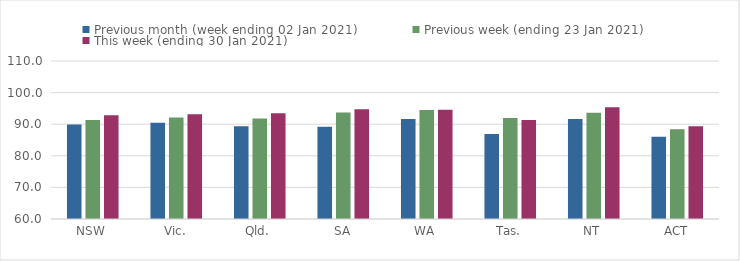
| Category | Previous month (week ending 02 Jan 2021) | Previous week (ending 23 Jan 2021) | This week (ending 30 Jan 2021) |
|---|---|---|---|
| NSW | 89.89 | 91.32 | 92.81 |
| Vic. | 90.47 | 92.15 | 93.12 |
| Qld. | 89.38 | 91.78 | 93.5 |
| SA | 89.17 | 93.69 | 94.75 |
| WA | 91.66 | 94.51 | 94.61 |
| Tas. | 86.91 | 91.98 | 91.34 |
| NT | 91.65 | 93.66 | 95.39 |
| ACT | 86 | 88.39 | 89.37 |